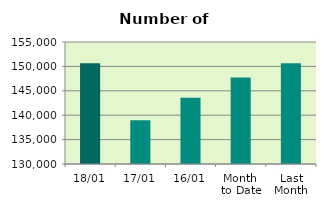
| Category | Series 0 |
|---|---|
| 18/01 | 150634 |
| 17/01 | 138958 |
| 16/01 | 143556 |
| Month 
to Date | 147718.923 |
| Last
Month | 150628.737 |